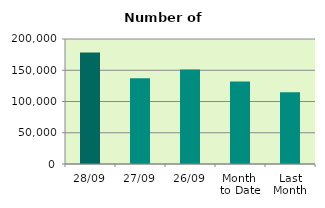
| Category | Series 0 |
|---|---|
| 28/09 | 178300 |
| 27/09 | 137094 |
| 26/09 | 151230 |
| Month 
to Date | 131824.5 |
| Last
Month | 114688 |